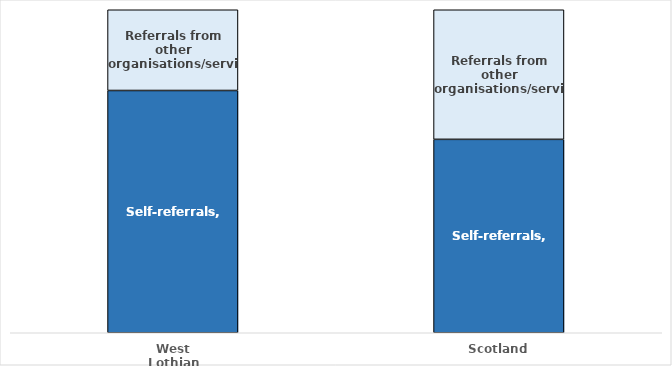
| Category | Self-referrals | Referrals from other organisations/services |
|---|---|---|
| West Lothian | 0.75 | 0.25 |
| Scotland | 0.599 | 0.401 |